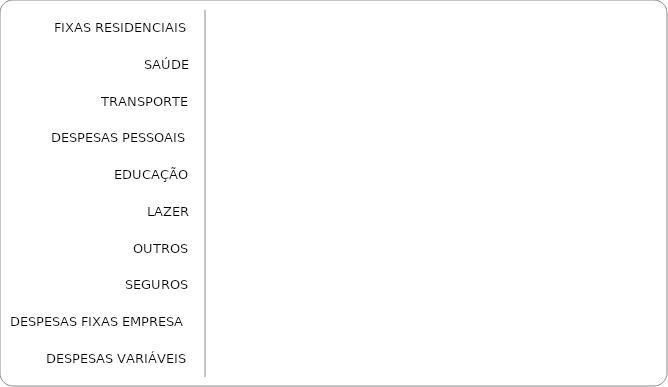
| Category | Series 0 |
|---|---|
| FIXAS RESIDENCIAIS | 0 |
| SAÚDE | 0 |
| TRANSPORTE | 0 |
| DESPESAS PESSOAIS | 0 |
| EDUCAÇÃO | 0 |
| LAZER | 0 |
| OUTROS | 0 |
| SEGUROS | 0 |
| DESPESAS FIXAS EMPRESA | 0 |
| DESPESAS VARIÁVEIS | 0 |